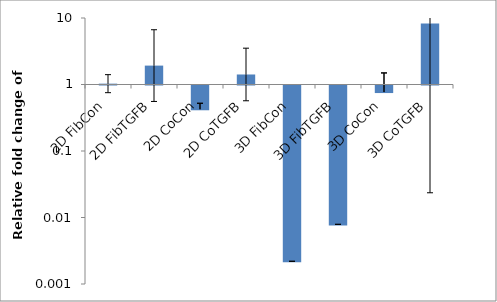
| Category | Series 0 |
|---|---|
| 2D FibCon | 1.029 |
| 2D FibTGFB | 1.924 |
| 2D CoCon | 0.424 |
| 2D CoTGFB | 1.415 |
| 3D FibCon | 0.002 |
| 3D FibTGFB | 0.008 |
| 3D CoCon | 0.77 |
| 3D CoTGFB | 8.298 |